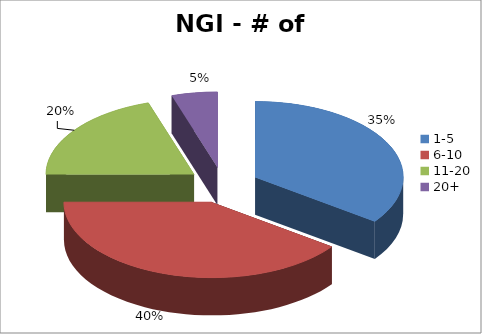
| Category | NGI Partners |
|---|---|
| 1-5 | 7 |
| 6-10 | 8 |
| 11-20 | 4 |
| 20+ | 1 |